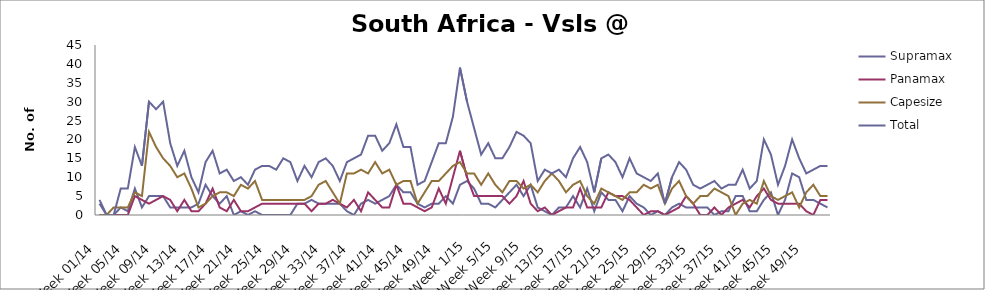
| Category | Supramax | Panamax | Capesize | Total |
|---|---|---|---|---|
| Week 01/14 | 3 | 0 | 0 | 4 |
| Week 02/14 | 0 | 0 | 0 | 0 |
| Week 03/14 | 0 | 0 | 2 | 0 |
| Week 04/14 | 2 | 0 | 2 | 7 |
| Week 05/14 | 1 | 0 | 2 | 7 |
| Week 06/14 | 7 | 5 | 6 | 18 |
| Week 07/14 | 2 | 4 | 5 | 13 |
| Week 08/14 | 5 | 3 | 22 | 30 |
| Week 09/14 | 5 | 4 | 18 | 28 |
| Week 10/14 | 5 | 5 | 15 | 30 |
| Week 11/14 | 2 | 4 | 13 | 19 |
| Week 12/14 | 2 | 1 | 10 | 13 |
| Week 13/14 | 2 | 4 | 11 | 17 |
| Week 14/14 | 2 | 1 | 7 | 10 |
| Week 15/14 | 3 | 1 | 2 | 6 |
| Week 16/14 | 8 | 3 | 3 | 14 |
| Week 17/14 | 5 | 7 | 5 | 17 |
| Week 18/14 | 3 | 2 | 6 | 11 |
| Week 19/14 | 5 | 1 | 6 | 12 |
| Week 20/14 | 0 | 4 | 5 | 9 |
| Week 21/14 | 1 | 1 | 8 | 10 |
| Week 22/14 | 0 | 1 | 7 | 8 |
| Week 23/14 | 1 | 2 | 9 | 12 |
| Week 24/14 | 0 | 3 | 4 | 13 |
| Week 25/14 | 0 | 3 | 4 | 13 |
| Week 26/14 | 0 | 3 | 4 | 12 |
| Week 27/14 | 0 | 3 | 4 | 15 |
| Week 28/14 | 0 | 3 | 4 | 14 |
| Week 29/14 | 3 | 3 | 4 | 9 |
| Week 30/14 | 3 | 3 | 4 | 13 |
| Week 31/14 | 4 | 1 | 5 | 10 |
| Week 32/14 | 3 | 3 | 8 | 14 |
| Week 33/14 | 3 | 3 | 9 | 15 |
| Week 34/14 | 3 | 4 | 6 | 13 |
| Week 35/14 | 3 | 3 | 3 | 9 |
| Week 36/14 | 1 | 2 | 11 | 14 |
| Week 37/14 | 0 | 4 | 11 | 15 |
| Week 38/14 | 3 | 1 | 12 | 16 |
| Week 39/14 | 4 | 6 | 11 | 21 |
| Week 40/14 | 3 | 4 | 14 | 21 |
| Week 41/14 | 4 | 2 | 11 | 17 |
| Week 42/14 | 5 | 2 | 12 | 19 |
| Week 43/14 | 8 | 8 | 8 | 24 |
| Week 44/14 | 6 | 3 | 9 | 18 |
| Week 45/14 | 6 | 3 | 9 | 18 |
| Week 46/14 | 3 | 2 | 3 | 8 |
| Week 47/14 | 2 | 1 | 6 | 9 |
| Week 48/14 | 3 | 2 | 9 | 14 |
| Week 49/14 | 3 | 7 | 9 | 19 |
| Week 50/14 | 5 | 3 | 11 | 19 |
| Week 51/14 | 3 | 10 | 13 | 26 |
| Week 52/14 | 8 | 17 | 14 | 39 |
| Week 1/15 | 9 | 10 | 11 | 30 |
| Week 2/15 | 7 | 5 | 11 | 23 |
| Week 3/15 | 3 | 5 | 8 | 16 |
| Week 4/15 | 3 | 5 | 11 | 19 |
| Week 5/15 | 2 | 5 | 8 | 15 |
| Week 6/15 | 4 | 5 | 6 | 15 |
| Week 7/15 | 6 | 3 | 9 | 18 |
| Week 8/15 | 8 | 5 | 9 | 22 |
| Week 9/15 | 5 | 9 | 7 | 21 |
| Week 10/15 | 8 | 3 | 8 | 19 |
| Week 11/15 | 2 | 1 | 6 | 9 |
| Week 12/15 | 1 | 2 | 9 | 12 |
| Week 13/15 | 0 | 0 | 11 | 11 |
| Week 14/15 | 2 | 1 | 9 | 12 |
| Week 15/15 | 2 | 2 | 6 | 10 |
| Week 16/15 | 5 | 2 | 8 | 15 |
| Week 17/15 | 2 | 7 | 9 | 18 |
| Week 18/15 | 7 | 2 | 5 | 14 |
| Week 19/15 | 1 | 2 | 3 | 6 |
| Week 20/15 | 6 | 2 | 7 | 15 |
| Week 21/15 | 4 | 6 | 6 | 16 |
| Week 22/15 | 4 | 5 | 5 | 14 |
| Week 23/15 | 1 | 5 | 4 | 10 |
| Week 24/15 | 5 | 4 | 6 | 15 |
| Week 25/15 | 3 | 2 | 6 | 11 |
| Week 26/15 | 2 | 0 | 8 | 10 |
| Week 27/15 | 0 | 1 | 7 | 9 |
| Week 28/15 | 1 | 1 | 8 | 11 |
| Week 29/15 | 0 | 0 | 3 | 3 |
| Week 30/15 | 2 | 1 | 7 | 10 |
| Week 31/15 | 3 | 2 | 9 | 14 |
| Week 32/15 | 2 | 5 | 5 | 12 |
| Week 33/15 | 2 | 3 | 3 | 8 |
| Week 34/15 | 2 | 0 | 5 | 7 |
| Week 35/15 | 2 | 0 | 5 | 8 |
| Week 36/15 | 0 | 2 | 7 | 9 |
| Week 37/15 | 1 | 0 | 6 | 7 |
| Week 38/15 | 1 | 2 | 5 | 8 |
| Week 39/15 | 5 | 3 | 0 | 8 |
| Week 40/15 | 5 | 4 | 3 | 12 |
| Week 41/15 | 1 | 2 | 4 | 7 |
| Week 42/15 | 1 | 5 | 3 | 9 |
| Week 43/15 | 4 | 7 | 9 | 20 |
| Week 44/15 | 6 | 4 | 5 | 16 |
| Week 45/15 | 0 | 3 | 4 | 8 |
| Week 46/15 | 4 | 3 | 5 | 13 |
| Week 47/15 | 11 | 3 | 6 | 20 |
| Week 48/15 | 10 | 3 | 2 | 15 |
| Week 49/15 | 4 | 1 | 6 | 11 |
| Week 50/15 | 4 | 0 | 8 | 12 |